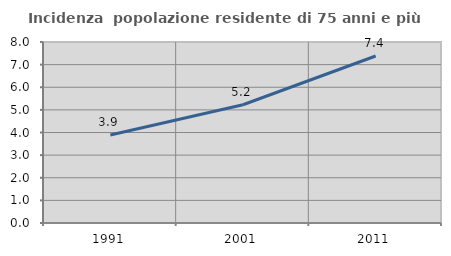
| Category | Incidenza  popolazione residente di 75 anni e più |
|---|---|
| 1991.0 | 3.892 |
| 2001.0 | 5.227 |
| 2011.0 | 7.382 |